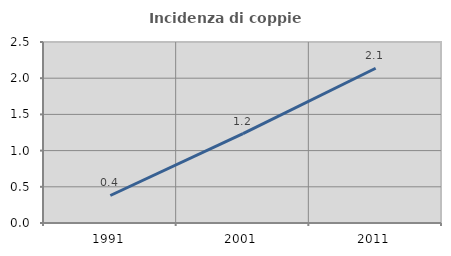
| Category | Incidenza di coppie miste |
|---|---|
| 1991.0 | 0.38 |
| 2001.0 | 1.235 |
| 2011.0 | 2.137 |